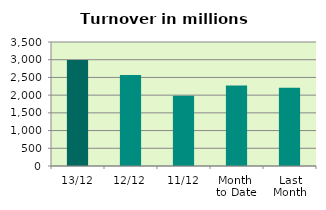
| Category | Series 0 |
|---|---|
| 13/12 | 2993.069 |
| 12/12 | 2567.849 |
| 11/12 | 1982.797 |
| Month 
to Date | 2270.159 |
| Last
Month | 2210.602 |